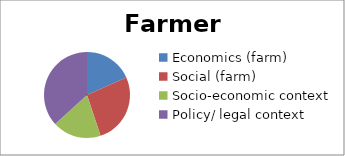
| Category | Farmers | Citizens | Total |
|---|---|---|---|
| Economics (farm) | 9 | 12 | 23 |
| Social (farm) | 13 | 19 | 40 |
| Socio-economic context | 9 | 17 | 31 |
| Policy/ legal context | 18 | 42 | 52 |